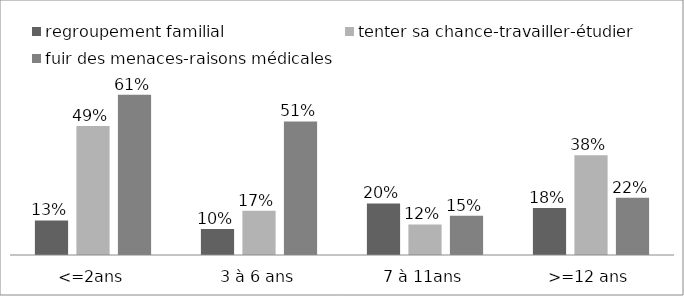
| Category | regroupement familial  | tenter sa chance-travailler-étudier | fuir des menaces-raisons médicales |
|---|---|---|---|
| <=2ans | 0.132 | 0.493 | 0.613 |
| 3 à 6 ans | 0.099 | 0.169 | 0.511 |
| 7 à 11ans | 0.197 | 0.117 | 0.15 |
| >=12 ans | 0.18 | 0.382 | 0.219 |